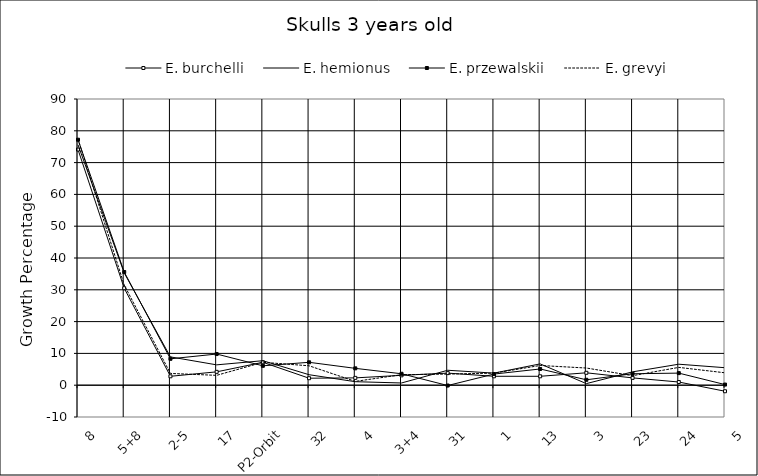
| Category | E. burchelli | E. hemionus | E. przewalskii | E. grevyi |
|---|---|---|---|---|
| 8 | 74.1 | 75.6 | 77.2 | 77.4 |
| 5+8 | 30.5 | 35.3 | 35.6 | 31.5 |
| 2-5 | 2.8 | 8.9 | 8.3 | 3.7 |
| 17 | 4.2 | 6.4 | 9.8 | 3.1 |
| P2-Orbit | 7.2 | 7.7 | 6.1 | 7.2 |
| 32 | 2.2 | 3.3 | 7.2 | 6.1 |
| 4 | 2.3 | 1.1 | 5.3 | 1.2 |
| 3+4 | 3.1 | 0.7 | 3.6 | 3.3 |
| 31 | 3.8 | 4.7 | -0.1 | 3.5 |
| 1 | 2.8 | 3.8 | 3.5 | 3.8 |
| 13 | 2.8 | 6.7 | 5.1 | 6.2 |
| 3 | 3.9 | 0.5 | 1.7 | 5.4 |
| 23 | 2.3 | 4.2 | 3.6 | 3 |
| 24 | 1 | 6.6 | 3.8 | 5.6 |
| 5 | -1.9 | 5.5 | 0.2 | 3.9 |